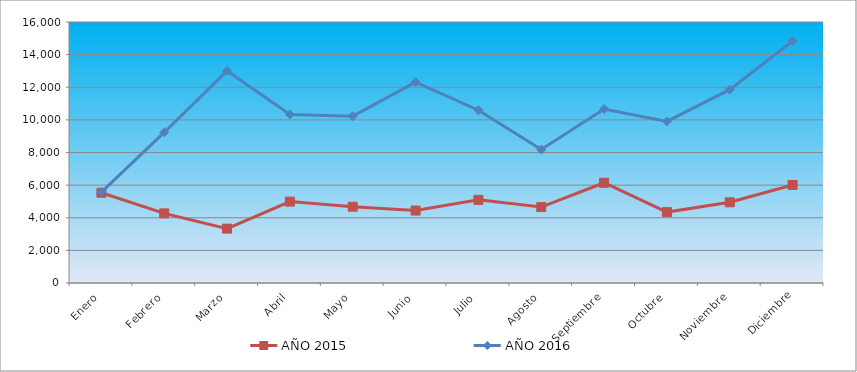
| Category | AÑO 2015 | AÑO 2016 |
|---|---|---|
| Enero | 5533 | 5570 |
| Febrero | 4268 | 9238 |
| Marzo | 3333 | 13004 |
| Abril | 4989 | 10334 |
| Mayo | 4676 | 10227 |
| Junio | 4441 | 12316 |
| Julio | 5098 | 10591 |
| Agosto | 4654 | 8178 |
| Septiembre | 6147 | 10665 |
| Octubre | 4346 | 9905 |
| Noviembre | 4948 | 11855 |
| Diciembre | 6009 | 14832 |